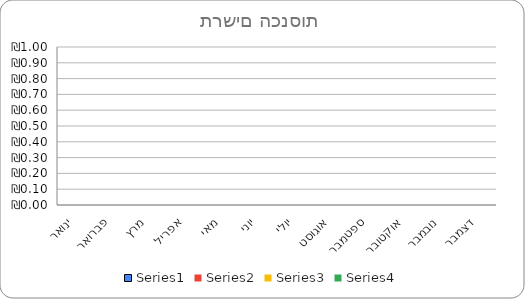
| Category | Series 0 | Series 1 | Series 2 | Series 3 |
|---|---|---|---|---|
| ינואר |  |  |  | 0 |
| פברואר |  |  |  | 0 |
| מרץ |  |  |  | 0 |
| אפריל |  |  |  | 0 |
| מאי |  |  |  | 0 |
| יוני |  |  |  | 0 |
| יולי |  |  |  | 0 |
| אוגוסט |  |  |  | 0 |
| ספטמבר |  |  |  | 0 |
| אוקטובר |  |  |  | 0 |
| נובמבר |  |  |  | 0 |
| דצמבר |  |  |  | 0 |